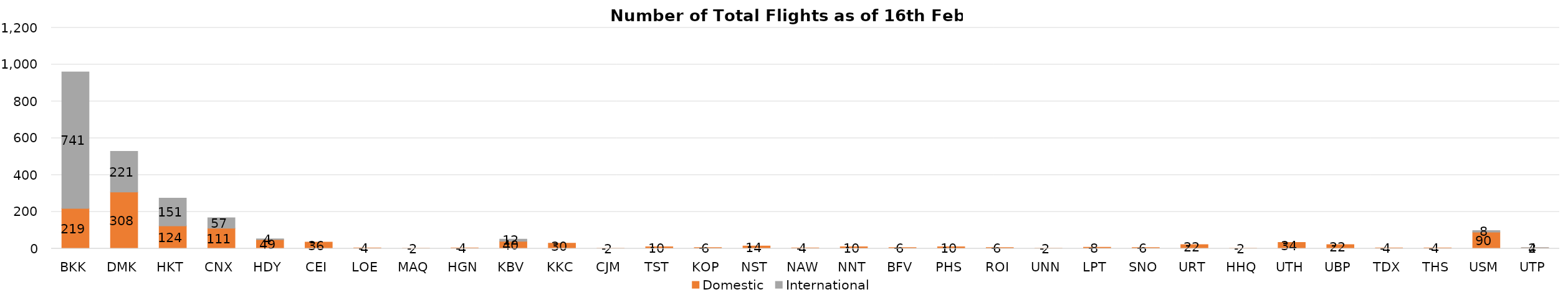
| Category | Domestic | International |
|---|---|---|
| BKK | 219 | 741 |
| DMK | 308 | 221 |
| HKT | 124 | 151 |
| CNX | 111 | 57 |
| HDY | 49 | 4 |
| CEI | 36 | 0 |
| LOE | 4 | 0 |
| MAQ | 2 | 0 |
| HGN | 4 | 0 |
| KBV | 40 | 12 |
| KKC | 30 | 0 |
| CJM | 2 | 0 |
| TST | 10 | 0 |
| KOP | 6 | 0 |
| NST | 14 | 0 |
| NAW | 4 | 0 |
| NNT | 10 | 0 |
| BFV | 6 | 0 |
| PHS | 10 | 0 |
| ROI | 6 | 0 |
| UNN | 2 | 0 |
| LPT | 8 | 0 |
| SNO | 6 | 0 |
| URT | 22 | 0 |
| HHQ | 2 | 0 |
| UTH | 34 | 0 |
| UBP | 22 | 0 |
| TDX | 4 | 0 |
| THS | 4 | 0 |
| USM | 90 | 8 |
| UTP | 4 | 2 |